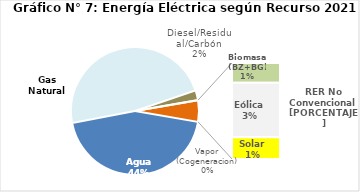
| Category | Series 0 |
|---|---|
| Agua | 2107.874 |
| Gas Natural | 2278.081 |
| Diesel/Residual/Carbón | 118.16 |
| Vapor (Cogeneracion) | 0.246 |
| Biomasa (BZ+BG) | 53.063 |
| Eólica | 147.452 |
| Solar | 58.62 |